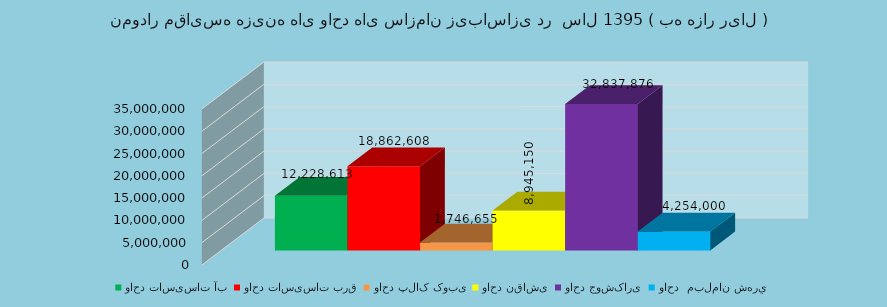
| Category | واحد تاسیسات آب | واحد تاسیسات برق | واحد پلاک کوبی | واحد نقاشی | واحد جوشکاری | واحد  مبلمان شهري  |
|---|---|---|---|---|---|---|
| 0 | 12228613 | 18862608 | 1746655 | 8945150 | 32837876 | 4254000 |